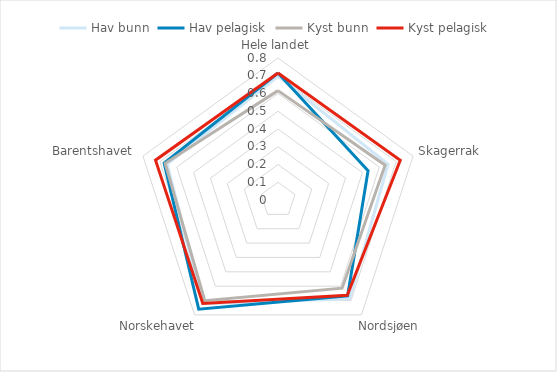
| Category | Hav bunn | Hav pelagisk | Kyst bunn | Kyst pelagisk  |
|---|---|---|---|---|
| Hele landet | 0.697 | 0.716 | 0.616 | 0.716 |
| Skagerrak | 0.652 | 0.533 | 0.635 | 0.724 |
| Nordsjøen | 0.687 | 0.667 | 0.614 | 0.664 |
| Norskehavet | 0.723 | 0.76 | 0.702 | 0.721 |
| Barentshavet | 0.657 | 0.674 | 0.668 | 0.726 |